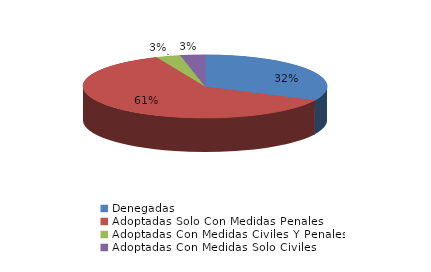
| Category | Series 0 |
|---|---|
| Denegadas | 10 |
| Adoptadas Solo Con Medidas Penales | 19 |
| Adoptadas Con Medidas Civiles Y Penales | 1 |
| Adoptadas Con Medidas Solo Civiles | 1 |